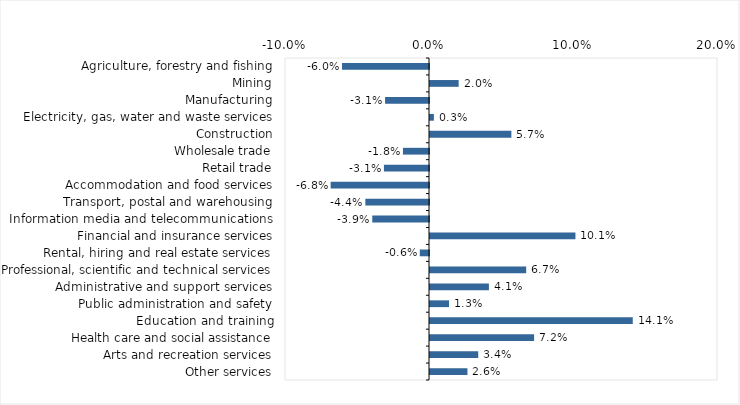
| Category | This week |
|---|---|
| Agriculture, forestry and fishing | -0.06 |
| Mining | 0.02 |
| Manufacturing | -0.03 |
| Electricity, gas, water and waste services | 0.003 |
| Construction | 0.056 |
| Wholesale trade | -0.018 |
| Retail trade | -0.031 |
| Accommodation and food services | -0.068 |
| Transport, postal and warehousing | -0.044 |
| Information media and telecommunications | -0.039 |
| Financial and insurance services | 0.101 |
| Rental, hiring and real estate services | -0.006 |
| Professional, scientific and technical services | 0.067 |
| Administrative and support services | 0.041 |
| Public administration and safety | 0.013 |
| Education and training | 0.141 |
| Health care and social assistance | 0.072 |
| Arts and recreation services | 0.034 |
| Other services | 0.026 |